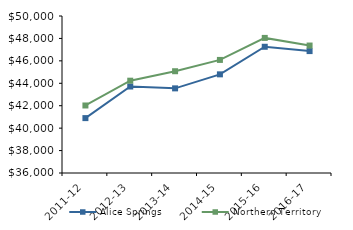
| Category | Alice Springs | Northern Territory |
|---|---|---|
| 2011-12 | 40894.47 | 42021 |
| 2012-13 | 43712.5 | 44232.02 |
| 2013-14 | 43546.97 | 45075.51 |
| 2014-15 | 44797.32 | 46083.65 |
| 2015-16 | 47256 | 48046.27 |
| 2016-17 | 46871 | 47367.05 |